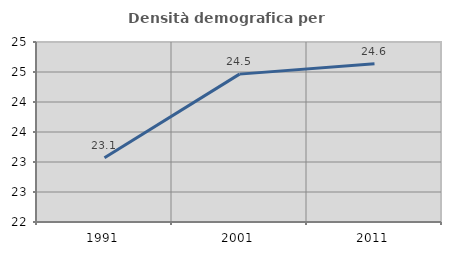
| Category | Densità demografica |
|---|---|
| 1991.0 | 23.071 |
| 2001.0 | 24.465 |
| 2011.0 | 24.639 |